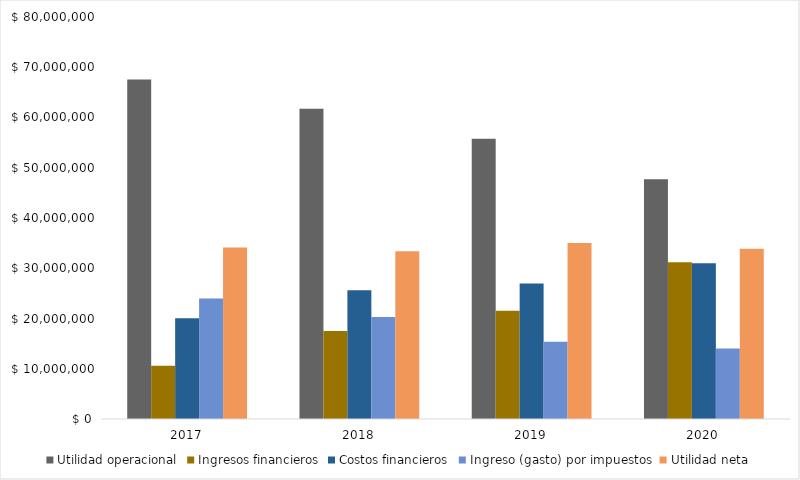
| Category |  Utilidad operacional  |  Ingresos financieros  |  Costos financieros  |  Ingreso (gasto) por impuestos  |  Utilidad neta  |
|---|---|---|---|---|---|
| 2017.0 | 67547823 | 10585693 | 20033004 | 23973404 | 34127108 |
| 2018.0 | 61749843 | 17528820 | 25597800 | 20286882 | 33393981 |
| 2019.0 | 55771679 | 21545547 | 26947947 | 15366816 | 35002463 |
| 2020.0 | 47713249 | 31212038 | 30987417 | 14049840 | 33888030 |